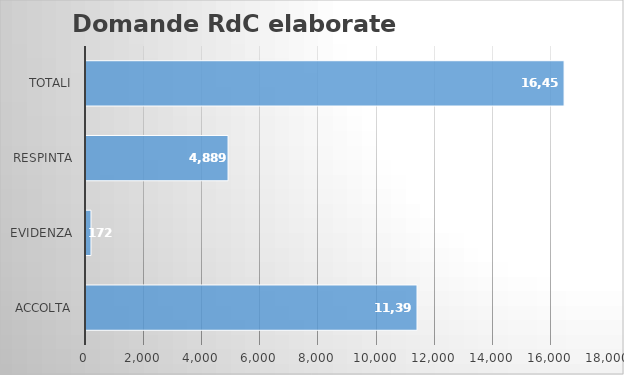
| Category | ABRUZZO                        |
|---|---|
| ACCOLTA | 11393 |
| EVIDENZA | 172 |
| RESPINTA | 4889 |
| Totali | 16454 |